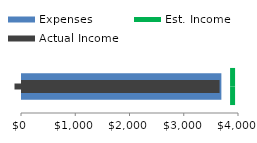
| Category | Expenses |
|---|---|
| Expenses | 3675 |